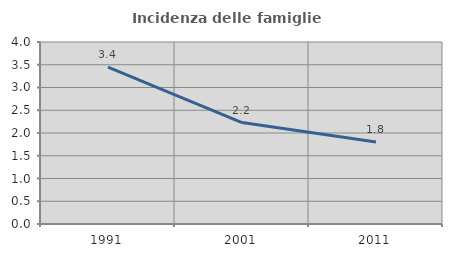
| Category | Incidenza delle famiglie numerose |
|---|---|
| 1991.0 | 3.448 |
| 2001.0 | 2.23 |
| 2011.0 | 1.805 |